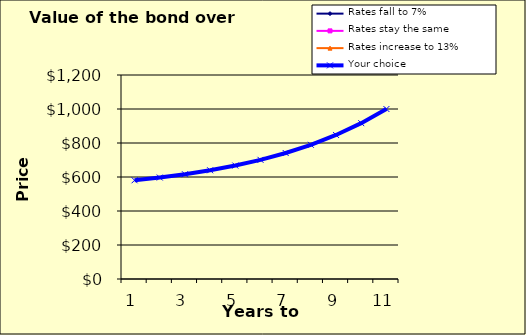
| Category | Rates fall to 7% | Rates stay the same | Rates increase to 13% | Your choice |
|---|---|---|---|---|
| 0 |  |  |  | 580.753 |
| 1 |  |  |  | 596.903 |
| 2 |  |  |  | 616.284 |
| 3 |  |  |  | 639.541 |
| 4 |  |  |  | 667.449 |
| 5 |  |  |  | 700.939 |
| 6 |  |  |  | 741.127 |
| 7 |  |  |  | 789.352 |
| 8 |  |  |  | 847.222 |
| 9 |  |  |  | 916.667 |
| 10 |  |  |  | 1000 |